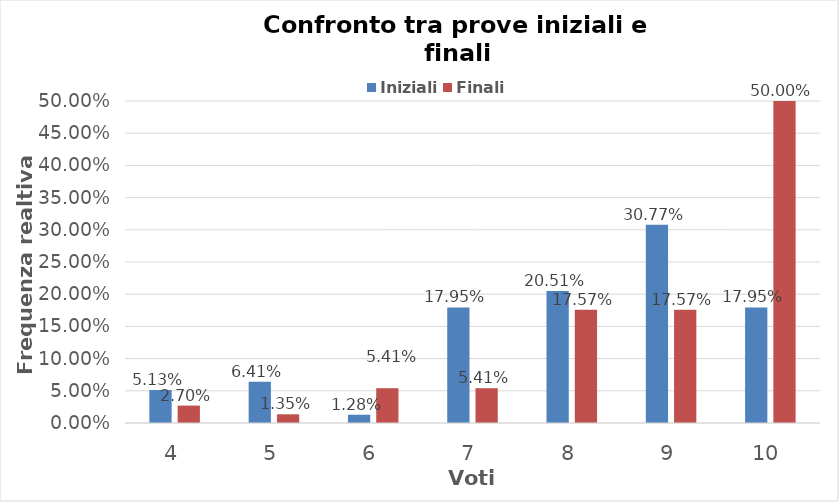
| Category | Iniziali | Finali |
|---|---|---|
| 4.0 | 0.051 | 0.027 |
| 5.0 | 0.064 | 0.014 |
| 6.0 | 0.013 | 0.054 |
| 7.0 | 0.179 | 0.054 |
| 8.0 | 0.205 | 0.176 |
| 9.0 | 0.308 | 0.176 |
| 10.0 | 0.179 | 0.5 |